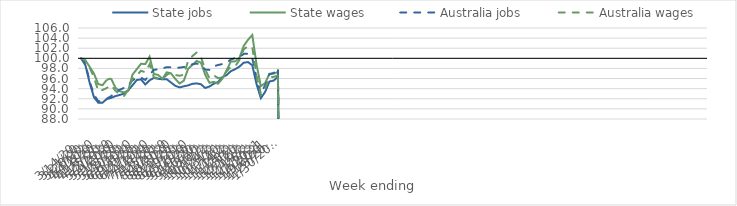
| Category | State jobs | State wages | Australia jobs | Australia wages |
|---|---|---|---|---|
| 14/03/2020 | 100 | 100 | 100 | 100 |
| 21/03/2020 | 98.626 | 99.588 | 98.956 | 99.595 |
| 28/03/2020 | 95.144 | 98.308 | 95.413 | 98.12 |
| 04/04/2020 | 92.295 | 96.971 | 92.814 | 96.244 |
| 11/04/2020 | 91.228 | 94.897 | 91.522 | 93.536 |
| 18/04/2020 | 91.236 | 94.696 | 91.5 | 93.735 |
| 25/04/2020 | 91.957 | 95.759 | 92.025 | 94.14 |
| 02/05/2020 | 92.17 | 96.012 | 92.519 | 94.693 |
| 09/05/2020 | 92.521 | 94.2 | 93.198 | 93.616 |
| 16/05/2020 | 92.754 | 93.5 | 93.788 | 92.845 |
| 23/05/2020 | 93.008 | 93.256 | 94.146 | 92.504 |
| 30/05/2020 | 93.675 | 93.594 | 94.65 | 93.808 |
| 06/06/2020 | 94.664 | 96.774 | 95.634 | 95.987 |
| 13/06/2020 | 95.701 | 97.851 | 96.135 | 96.641 |
| 20/06/2020 | 95.838 | 98.92 | 96.154 | 97.544 |
| 27/06/2020 | 94.824 | 98.868 | 95.728 | 97.236 |
| 04/07/2020 | 95.655 | 100.331 | 96.767 | 98.815 |
| 11/07/2020 | 96.124 | 96.907 | 97.729 | 96.243 |
| 18/07/2020 | 95.957 | 96.71 | 97.82 | 96.079 |
| 25/07/2020 | 95.841 | 95.957 | 98.028 | 95.887 |
| 01/08/2020 | 95.87 | 97.233 | 98.238 | 96.723 |
| 08/08/2020 | 95.218 | 97.03 | 98.223 | 97.204 |
| 15/08/2020 | 94.566 | 95.945 | 98.112 | 96.712 |
| 22/08/2020 | 94.255 | 95.018 | 98.158 | 96.554 |
| 29/08/2020 | 94.468 | 95.58 | 98.287 | 96.77 |
| 05/09/2020 | 94.649 | 97.932 | 98.443 | 99.477 |
| 12/09/2020 | 94.961 | 98.694 | 98.829 | 100.444 |
| 19/09/2020 | 95.041 | 99.484 | 98.97 | 101.162 |
| 26/09/2020 | 94.879 | 99.149 | 98.7 | 100.248 |
| 03/10/2020 | 94.127 | 96.735 | 97.765 | 97.757 |
| 10/10/2020 | 94.436 | 95.162 | 97.711 | 96.071 |
| 17/10/2020 | 94.97 | 95.343 | 98.435 | 96.645 |
| 24/10/2020 | 95.319 | 94.983 | 98.68 | 96.08 |
| 31/10/2020 | 96.272 | 95.967 | 98.863 | 96.206 |
| 07/11/2020 | 96.699 | 97.654 | 99.129 | 97.432 |
| 14/11/2020 | 97.474 | 99.369 | 99.776 | 98.33 |
| 21/11/2020 | 97.848 | 99.404 | 100.039 | 98.416 |
| 28/11/2020 | 98.369 | 100.111 | 100.264 | 99.694 |
| 05/12/2020 | 99.137 | 102.463 | 100.878 | 101.784 |
| 12/12/2020 | 99.258 | 103.669 | 100.916 | 102.402 |
| 19/12/2020 | 98.633 | 104.62 | 100.035 | 102.249 |
| 26/12/2020 | 94.88 | 98.734 | 96.089 | 96.528 |
| 02/01/2021 | 92.13 | 94.491 | 92.998 | 92.765 |
| 09/01/2021 | 93.359 | 95.086 | 94.651 | 94.062 |
| 16/01/2021 | 95.41 | 96.954 | 96.853 | 96.284 |
| 23/01/2021 | 95.597 | 96.976 | 97.109 | 96.336 |
| 30/01/2021 | 96.345 | 97.299 | 98.068 | 96.635 |